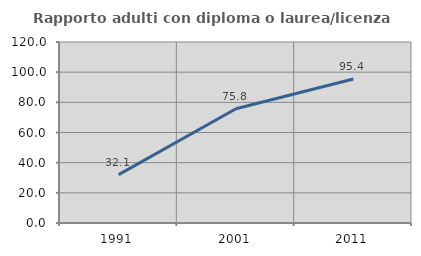
| Category | Rapporto adulti con diploma o laurea/licenza media  |
|---|---|
| 1991.0 | 32.11 |
| 2001.0 | 75.781 |
| 2011.0 | 95.42 |